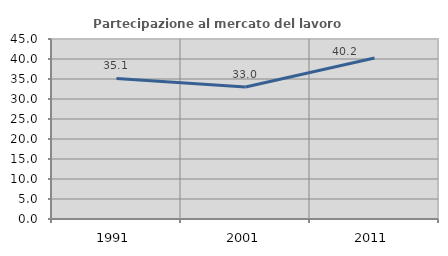
| Category | Partecipazione al mercato del lavoro  femminile |
|---|---|
| 1991.0 | 35.128 |
| 2001.0 | 33.011 |
| 2011.0 | 40.239 |